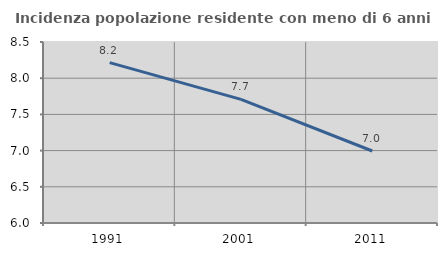
| Category | Incidenza popolazione residente con meno di 6 anni |
|---|---|
| 1991.0 | 8.216 |
| 2001.0 | 7.707 |
| 2011.0 | 6.994 |